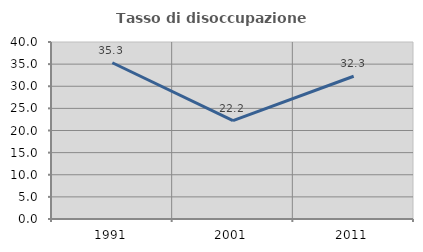
| Category | Tasso di disoccupazione giovanile  |
|---|---|
| 1991.0 | 35.313 |
| 2001.0 | 22.234 |
| 2011.0 | 32.253 |